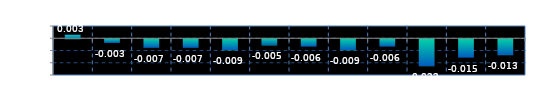
| Category | Series 0 |
|---|---|
| 0 | 0.003 |
| 1 | -0.003 |
| 2 | -0.007 |
| 3 | -0.007 |
| 4 | -0.009 |
| 5 | -0.005 |
| 6 | -0.006 |
| 7 | -0.009 |
| 8 | -0.006 |
| 9 | -0.022 |
| 10 | -0.015 |
| 11 | -0.013 |